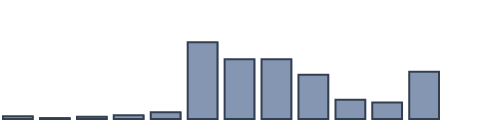
| Category | Series 0 |
|---|---|
| 0 | 0.824 |
| 1 | 0.275 |
| 2 | 0.654 |
| 3 | 1.078 |
| 4 | 1.985 |
| 5 | 22.587 |
| 6 | 17.606 |
| 7 | 17.592 |
| 8 | 12.99 |
| 9 | 5.662 |
| 10 | 4.856 |
| 11 | 13.891 |
| 12 | 0 |